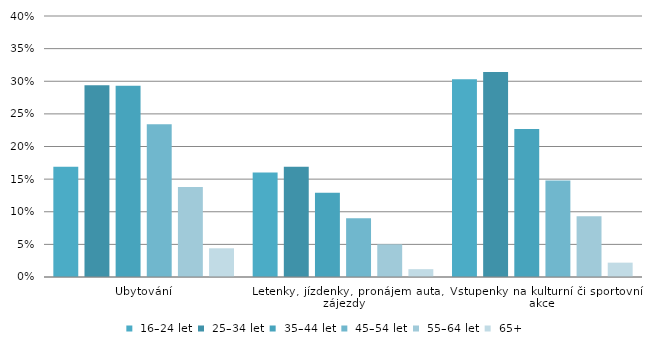
| Category |  16–24 let |  25–34 let |  35–44 let |  45–54 let |  55–64 let |  65+ |
|---|---|---|---|---|---|---|
| Ubytování | 0.169 | 0.294 | 0.293 | 0.234 | 0.138 | 0.044 |
| Letenky, jízdenky, pronájem auta, zájezdy | 0.16 | 0.169 | 0.129 | 0.09 | 0.05 | 0.012 |
| Vstupenky na kulturní či sportovní akce | 0.303 | 0.314 | 0.227 | 0.148 | 0.093 | 0.022 |